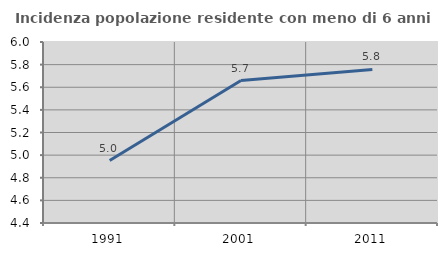
| Category | Incidenza popolazione residente con meno di 6 anni |
|---|---|
| 1991.0 | 4.952 |
| 2001.0 | 5.659 |
| 2011.0 | 5.757 |